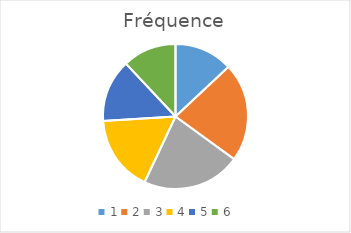
| Category | Fréquence |
|---|---|
| 1.0 | 0.13 |
| 2.0 | 0.22 |
| 3.0 | 0.22 |
| 4.0 | 0.17 |
| 5.0 | 0.14 |
| 6.0 | 0.12 |